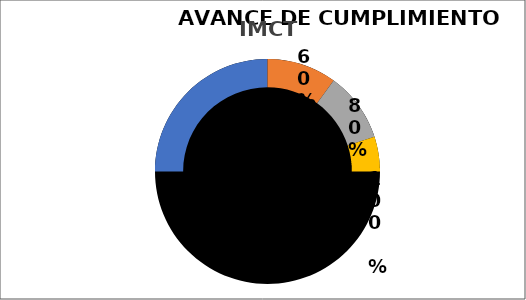
| Category | PUNTERO |
|---|---|
| 0 | 0 |
| 1 | 0.015 |
| 2 | 0 |